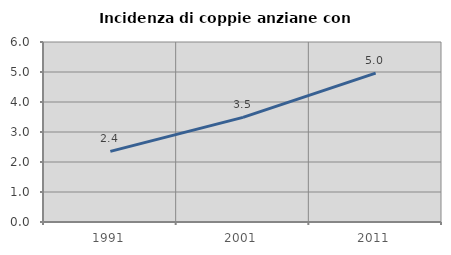
| Category | Incidenza di coppie anziane con figli |
|---|---|
| 1991.0 | 2.353 |
| 2001.0 | 3.488 |
| 2011.0 | 4.962 |